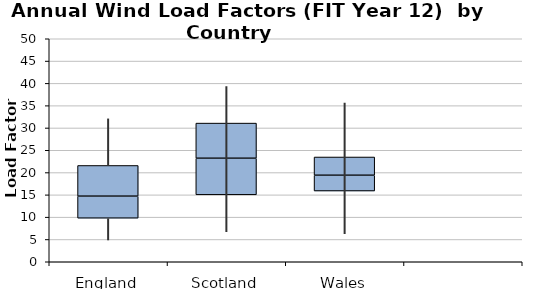
| Category | Series 0 | Series 1 | Series 2 |
|---|---|---|---|
| 0 | 9.77 | 4.94 | 6.88 |
| 1 | 15.01 | 8.2 | 7.88 |
| 2 | 15.86 | 3.54 | 4.09 |